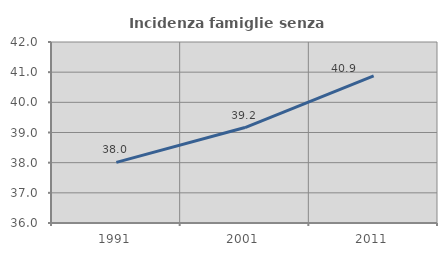
| Category | Incidenza famiglie senza nuclei |
|---|---|
| 1991.0 | 38.009 |
| 2001.0 | 39.163 |
| 2011.0 | 40.878 |